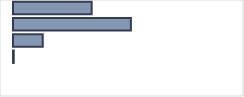
| Category | Series 0 |
|---|---|
| 0 | 34.657 |
| 1 | 51.931 |
| 2 | 13.081 |
| 3 | 0.331 |
| 4 | 0 |